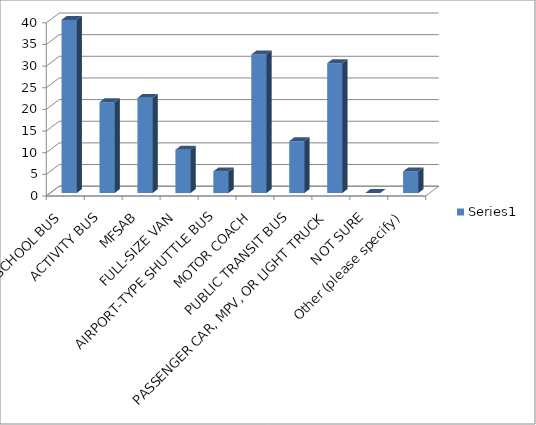
| Category | Series 0 |
|---|---|
| SCHOOL BUS | 40 |
| ACTIVITY BUS | 21 |
| MFSAB | 22 |
| FULL-SIZE VAN | 10 |
| AIRPORT-TYPE SHUTTLE BUS | 5 |
| MOTOR COACH | 32 |
| PUBLIC TRANSIT BUS | 12 |
| PASSENGER CAR, MPV, OR LIGHT TRUCK | 30 |
| NOT SURE | 0 |
| Other (please specify) | 5 |